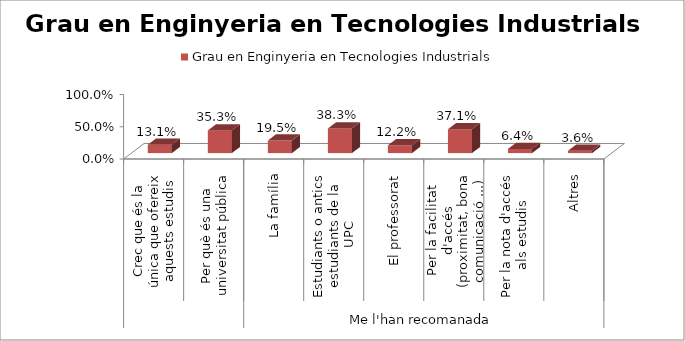
| Category | Grau en Enginyeria en Tecnologies Industrials |
|---|---|
| 0 | 0.131 |
| 1 | 0.353 |
| 2 | 0.195 |
| 3 | 0.383 |
| 4 | 0.122 |
| 5 | 0.371 |
| 6 | 0.064 |
| 7 | 0.036 |